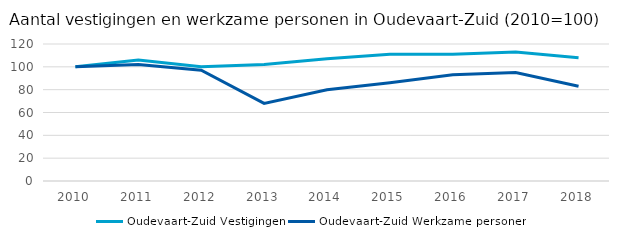
| Category | Oudevaart-Zuid |
|---|---|
| 2010.0 | 100 |
| 2011.0 | 102 |
| 2012.0 | 97 |
| 2013.0 | 68 |
| 2014.0 | 80 |
| 2015.0 | 86 |
| 2016.0 | 93 |
| 2017.0 | 95 |
| 2018.0 | 83 |